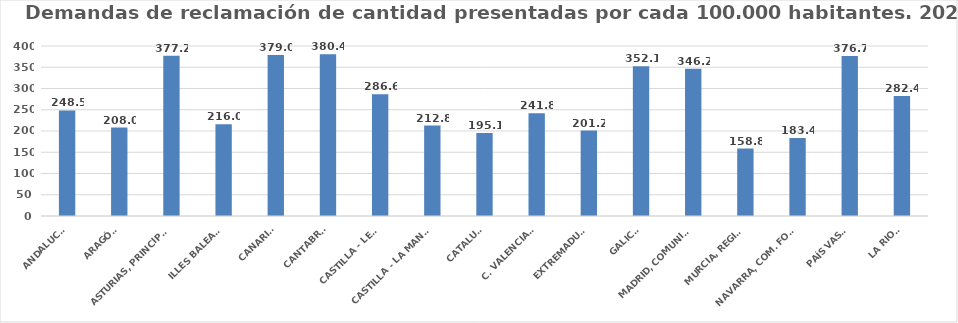
| Category | Series 0 |
|---|---|
| ANDALUCÍA | 248.458 |
| ARAGÓN | 207.955 |
| ASTURIAS, PRINCIPADO | 377.209 |
| ILLES BALEARS | 216.039 |
| CANARIAS | 378.959 |
| CANTABRIA | 380.44 |
| CASTILLA - LEÓN | 286.624 |
| CASTILLA - LA MANCHA | 212.773 |
| CATALUÑA | 195.087 |
| C. VALENCIANA | 241.785 |
| EXTREMADURA | 201.175 |
| GALICIA | 352.148 |
| MADRID, COMUNIDAD | 346.184 |
| MURCIA, REGIÓN | 158.822 |
| NAVARRA, COM. FORAL | 183.428 |
| PAÍS VASCO | 376.682 |
| LA RIOJA | 282.378 |